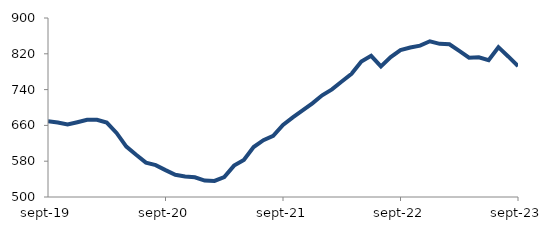
| Category | Series 0 |
|---|---|
| 2019-09-01 | 669.196 |
| 2019-10-01 | 666.5 |
| 2019-11-01 | 662.174 |
| 2019-12-01 | 667.143 |
| 2020-01-01 | 672.455 |
| 2020-02-01 | 672.659 |
| 2020-03-01 | 666.213 |
| 2020-04-01 | 643.145 |
| 2020-05-01 | 612.572 |
| 2020-06-01 | 594.292 |
| 2020-07-01 | 576.858 |
| 2020-08-01 | 571.224 |
| 2020-09-01 | 560.032 |
| 2020-10-01 | 549.541 |
| 2020-11-01 | 545.982 |
| 2020-12-01 | 544.038 |
| 2021-01-01 | 536.772 |
| 2021-02-01 | 535.938 |
| 2021-03-01 | 544.717 |
| 2021-04-01 | 570.16 |
| 2021-05-01 | 582.981 |
| 2021-06-01 | 611.684 |
| 2021-07-01 | 627.037 |
| 2021-08-01 | 636.642 |
| 2021-09-01 | 661.114 |
| 2021-10-01 | 677.889 |
| 2021-11-01 | 693.389 |
| 2021-12-01 | 709.343 |
| 2022-01-01 | 727.31 |
| 2022-02-01 | 740.539 |
| 2022-03-01 | 758.027 |
| 2022-04-01 | 775.241 |
| 2022-05-01 | 802.956 |
| 2022-06-01 | 815.434 |
| 2022-07-01 | 791.89 |
| 2022-08-01 | 812.76 |
| 2022-09-01 | 828.12 |
| 2022-10-01 | 834 |
| 2022-11-01 | 838.178 |
| 2022-12-01 | 847.954 |
| 2023-01-01 | 842.285 |
| 2023-02-01 | 841.25 |
| 2023-03-01 | 826.38 |
| 2023-04-01 | 811.394 |
| 2023-05-01 | 812.228 |
| 2023-06-01 | 805.926 |
| 2023-07-01 | 834.815 |
| 2023-08-01 | 814.103 |
| 2023-09-01 | 792.442 |